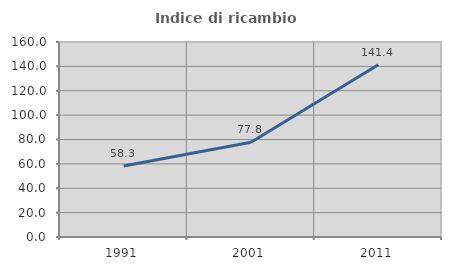
| Category | Indice di ricambio occupazionale  |
|---|---|
| 1991.0 | 58.312 |
| 2001.0 | 77.812 |
| 2011.0 | 141.379 |